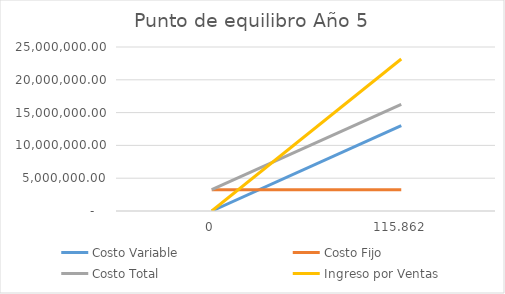
| Category | Costo Variable | Costo Fijo | Costo Total | Ingreso por Ventas |
|---|---|---|---|---|
| 0 | 0 | 3256950.667 | 3256950.667 | 0 |
| 1 | 13011110.127 | 3256950.667 | 16268060.794 | 23172400 |